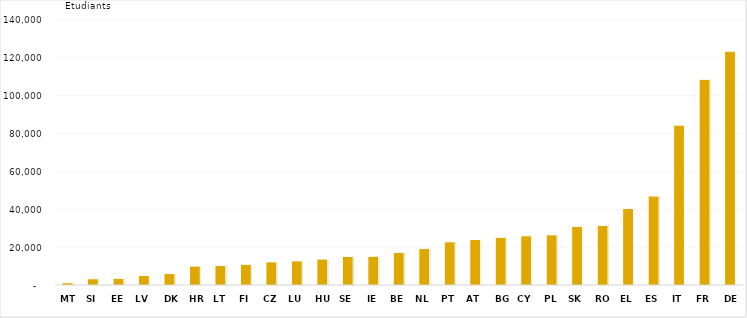
| Category | 2020 |
|---|---|
| MT | 1211 |
| SI | 3288 |
| EE | 3524 |
| LV | 5025 |
| DK | 6041 |
| HR | 10003 |
| LT | 10278 |
| FI | 10946 |
| CZ | 12195 |
| LU | 12709 |
| HU | 13706 |
| SE | 15092 |
| IE | 15183 |
| BE | 17168 |
| NL | 19285 |
| PT | 22807 |
| AT | 23998 |
| BG | 25185 |
| CY | 25978 |
| PL | 26495 |
| SK | 30901 |
| RO | 31486 |
| EL | 40395 |
| ES | 46994 |
| IT | 84449 |
| FR | 108654 |
| DE | 123512 |